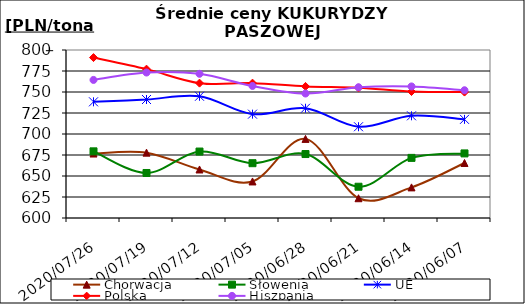
| Category | Chorwacja | Słowenia | UE | Polska | Hiszpania |
|---|---|---|---|---|---|
| 2020-07-26 | 676.735 | 679.344 | 738.303 | 790.986 | 764.373 |
| 2020-07-19 | 677.802 | 653.579 | 741.071 | 777.206 | 773.186 |
| 2020-07-12 | 657.767 | 679.099 | 744.908 | 760.551 | 771.643 |
| 2020-07-05 | 643.522 | 665.24 | 723.64 | 760.551 | 757.213 |
| 2020-06-28 | 694.186 | 676.146 | 730.68 | 756.654 | 748.205 |
| 2020-06-21 | 623.54 | 637.205 | 708.64 | 754.937 | 755.667 |
| 2020-06-14 | 636.45 | 671.566 | 721.666 | 750.578 | 756.619 |
| 2020-06-07 | 665.506 | 676.887 | 717.434 | 749.891 | 752.097 |